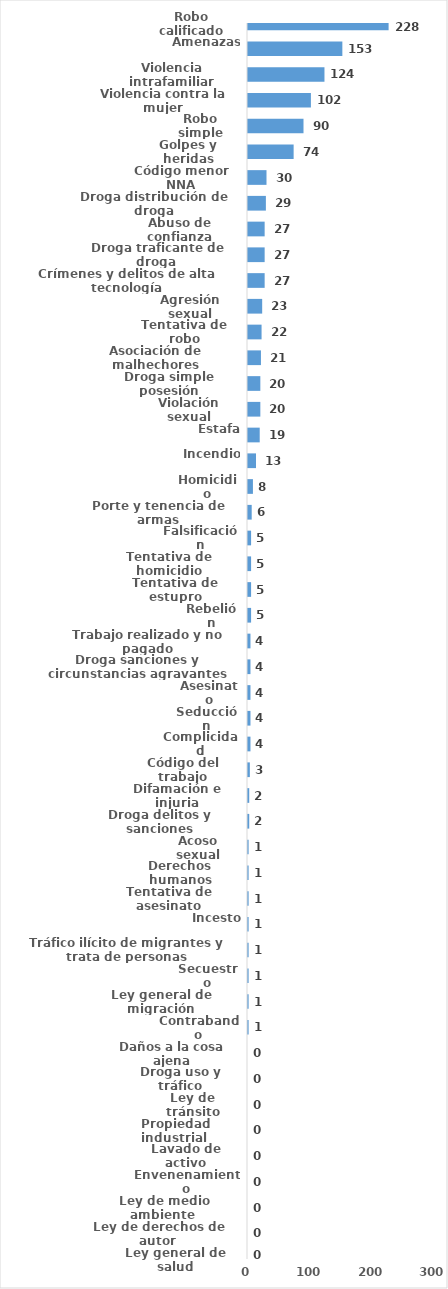
| Category | Series 0 |
|---|---|
| Robo calificado | 228 |
| Amenazas | 153 |
| Violencia intrafamiliar | 124 |
| Violencia contra la mujer | 102 |
| Robo simple | 90 |
| Golpes y heridas | 74 |
| Código menor NNA | 30 |
| Droga distribución de droga | 29 |
| Abuso de confianza | 27 |
| Droga traficante de droga  | 27 |
| Crímenes y delitos de alta tecnología | 27 |
| Agresión sexual | 23 |
| Tentativa de robo | 22 |
| Asociación de malhechores | 21 |
| Droga simple posesión | 20 |
| Violación sexual | 20 |
| Estafa | 19 |
| Incendio | 13 |
| Homicidio | 8 |
| Porte y tenencia de armas | 6 |
| Falsificación | 5 |
| Tentativa de homicidio | 5 |
| Tentativa de estupro | 5 |
| Rebelión | 5 |
| Trabajo realizado y no pagado | 4 |
| Droga sanciones y circunstancias agravantes | 4 |
| Asesinato | 4 |
| Seducción | 4 |
| Complicidad | 4 |
| Código del trabajo | 3 |
| Difamación e injuria | 2 |
| Droga delitos y sanciones | 2 |
| Acoso sexual | 1 |
| Derechos humanos | 1 |
| Tentativa de asesinato | 1 |
| Incesto | 1 |
| Tráfico ilícito de migrantes y trata de personas | 1 |
| Secuestro | 1 |
| Ley general de migración | 1 |
| Contrabando | 1 |
| Daños a la cosa ajena | 0 |
| Droga uso y tráfico | 0 |
| Ley de tránsito | 0 |
| Propiedad industrial  | 0 |
| Lavado de activo | 0 |
| Envenenamiento | 0 |
| Ley de medio ambiente  | 0 |
| Ley de derechos de autor  | 0 |
| Ley general de salud | 0 |